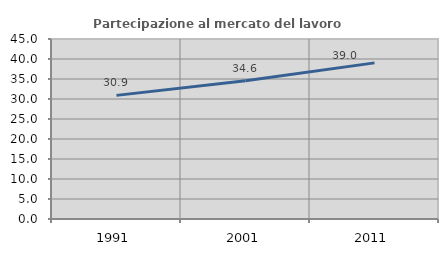
| Category | Partecipazione al mercato del lavoro  femminile |
|---|---|
| 1991.0 | 30.906 |
| 2001.0 | 34.579 |
| 2011.0 | 39.035 |